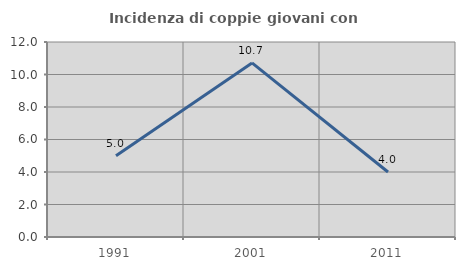
| Category | Incidenza di coppie giovani con figli |
|---|---|
| 1991.0 | 5 |
| 2001.0 | 10.714 |
| 2011.0 | 4 |